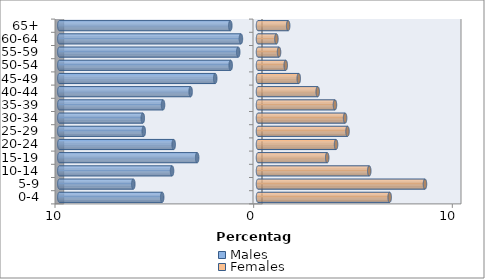
| Category | Males | Females |
|---|---|---|
| 0-4 | -4.823 | 6.628 |
| 5-9 | -6.276 | 8.405 |
| 10-14 | -4.327 | 5.601 |
| 15-19 | -3.062 | 3.484 |
| 20-24 | -4.244 | 3.929 |
| 25-29 | -5.751 | 4.506 |
| 30-34 | -5.799 | 4.384 |
| 35-39 | -4.78 | 3.873 |
| 40-44 | -3.392 | 3.006 |
| 45-49 | -2.153 | 2.052 |
| 50-54 | -1.375 | 1.396 |
| 55-59 | -0.996 | 1.059 |
| 60-64 | -0.86 | 0.926 |
| 65+ | -1.394 | 1.518 |